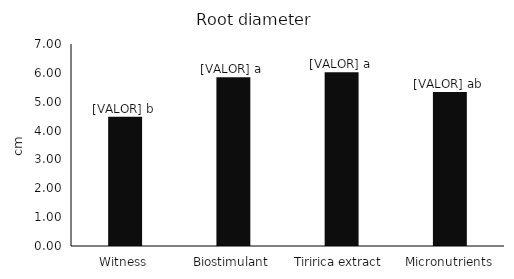
| Category | Series 0 |
|---|---|
| Witness | 4.482 |
| Biostimulant | 5.845 |
| Tiririca extract  | 6.018 |
| Micronutrients | 5.332 |